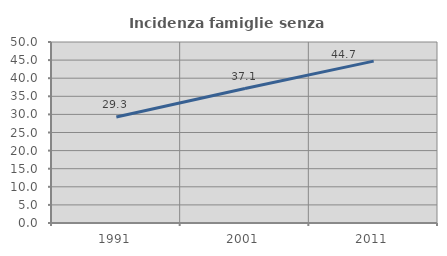
| Category | Incidenza famiglie senza nuclei |
|---|---|
| 1991.0 | 29.268 |
| 2001.0 | 37.131 |
| 2011.0 | 44.715 |